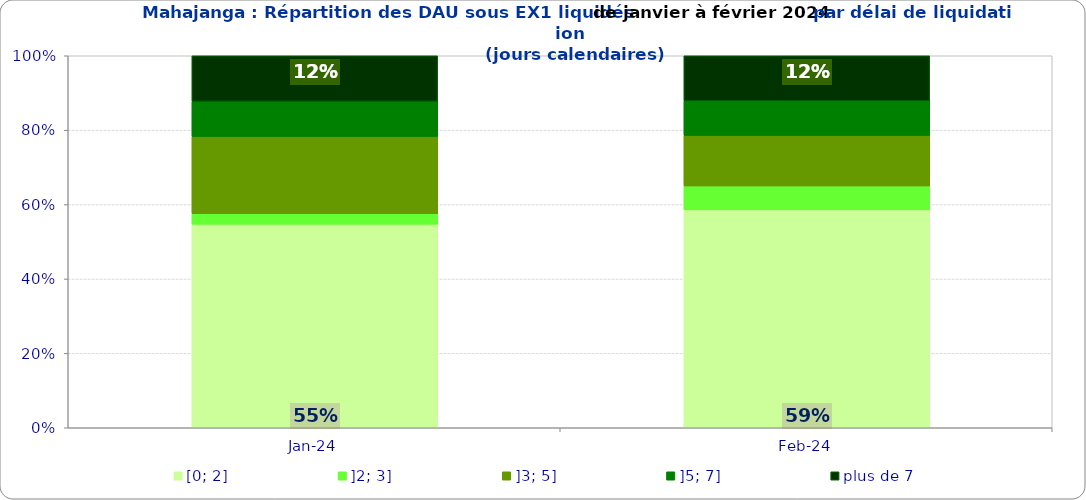
| Category | [0; 2] | ]2; 3] | ]3; 5] | ]5; 7] | plus de 7 |
|---|---|---|---|---|---|
| 2024-01-01 | 0.547 | 0.028 | 0.208 | 0.094 | 0.123 |
| 2024-02-01 | 0.586 | 0.064 | 0.136 | 0.093 | 0.121 |